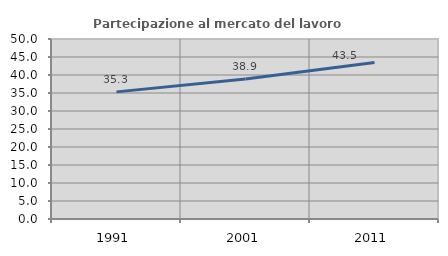
| Category | Partecipazione al mercato del lavoro  femminile |
|---|---|
| 1991.0 | 35.313 |
| 2001.0 | 38.912 |
| 2011.0 | 43.469 |